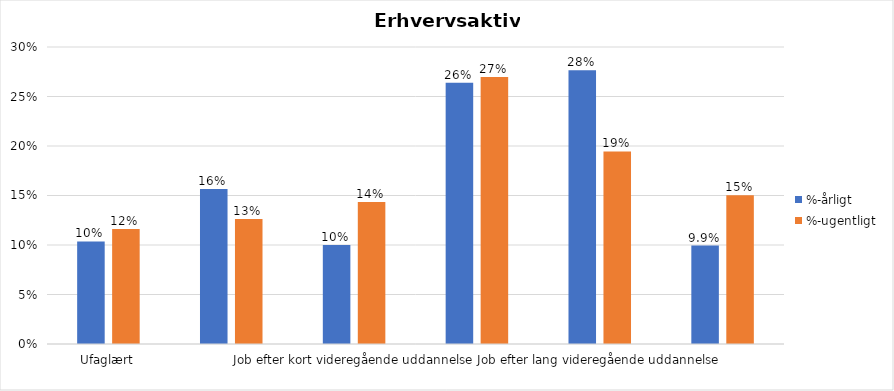
| Category | %-årligt | %-ugentligt |
|---|---|---|
| Ufaglært | 0.104 | 0.116 |
| Erhvervsfagligt job | 0.157 | 0.126 |
| Job efter kort videregående uddannelse | 0.1 | 0.143 |
| Job efter mellemlang videregående uddannelse | 0.264 | 0.27 |
| Job efter lang videregående uddannelse | 0.277 | 0.195 |
| Selvstændig | 0.099 | 0.15 |